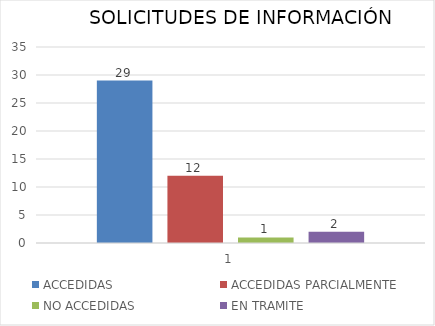
| Category | ACCEDIDAS | ACCEDIDAS PARCIALMENTE | NO ACCEDIDAS | EN TRAMITE |
|---|---|---|---|---|
| 0 | 29 | 12 | 1 | 2 |